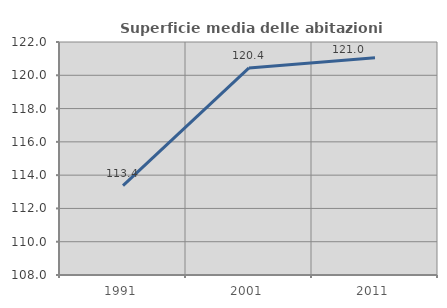
| Category | Superficie media delle abitazioni occupate |
|---|---|
| 1991.0 | 113.369 |
| 2001.0 | 120.443 |
| 2011.0 | 121.047 |